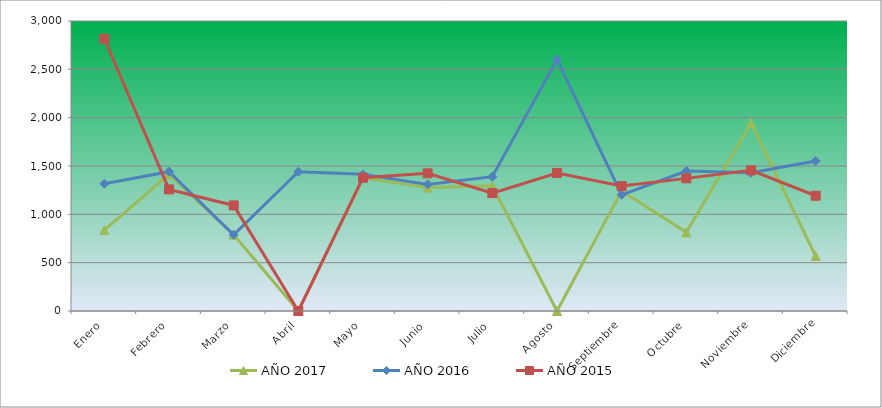
| Category | AÑO 2017 | AÑO 2016 | AÑO 2015 |
|---|---|---|---|
| Enero | 837.666 | 1316.181 | 2816.598 |
| Febrero | 1413.561 | 1441.201 | 1257.965 |
| Marzo | 788.802 | 788.32 | 1092.08 |
| Abril | 0 | 1441.201 | 0 |
| Mayo | 1378.658 | 1413.419 | 1378.923 |
| Junio | 1277.44 | 1309.235 | 1423.851 |
| Julio | 1294.892 | 1389.109 | 1219.95 |
| Agosto | 0 | 2601.107 | 1427.307 |
| Septiembre | 1242.538 | 1201.58 | 1292.525 |
| Octubre | 813.234 | 1448.146 | 1372.011 |
| Noviembre | 1944.083 | 1430.783 | 1454.954 |
| Diciembre | 568.915 | 1552.33 | 1192.302 |